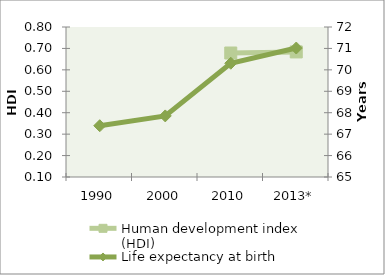
| Category | Human development index (HDI) |
|---|---|
| 1990 | 0 |
| 2000 | 0 |
| 2010 | 0.679 |
| 2013* | 0.684 |